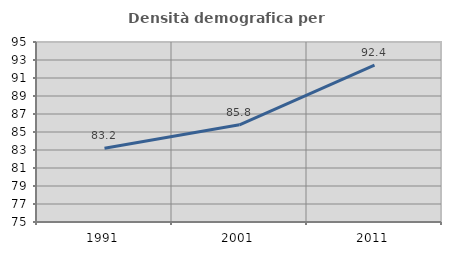
| Category | Densità demografica |
|---|---|
| 1991.0 | 83.194 |
| 2001.0 | 85.797 |
| 2011.0 | 92.429 |